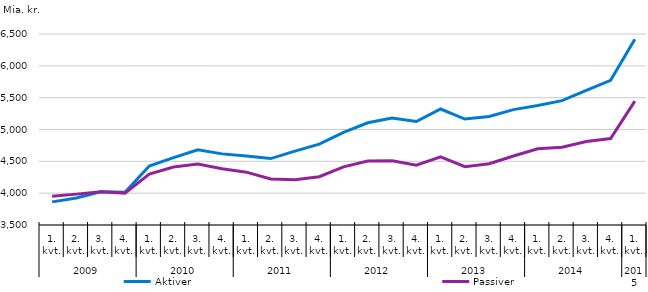
| Category | Aktiver | Passiver |
|---|---|---|
| 0 | 3863 | 3953 |
| 1900-01-01 | 3923 | 3985 |
| 1900-01-02 | 4023 | 4024 |
| 1900-01-03 | 4016 | 4001 |
| 1900-01-04 | 4426 | 4301 |
| 1900-01-05 | 4558 | 4410 |
| 1900-01-06 | 4682 | 4456 |
| 1900-01-07 | 4617 | 4384 |
| 1900-01-08 | 4582 | 4330 |
| 1900-01-09 | 4543 | 4224 |
| 1900-01-10 | 4661 | 4210 |
| 1900-01-11 | 4771 | 4258 |
| 1900-01-12 | 4955 | 4413 |
| 1900-01-13 | 5105 | 4504 |
| 1900-01-14 | 5179 | 4509 |
| 1900-01-15 | 5125 | 4438 |
| 1900-01-16 | 5322 | 4570 |
| 1900-01-17 | 5164 | 4416 |
| 1900-01-18 | 5205 | 4462 |
| 1900-01-19 | 5312 | 4584 |
| 1900-01-20 | 5376 | 4697 |
| 1900-01-21 | 5454 | 4722 |
| 1900-01-22 | 5616 | 4810 |
| 1900-01-23 | 5772 | 4857 |
| 1900-01-24 | 6418 | 5446 |